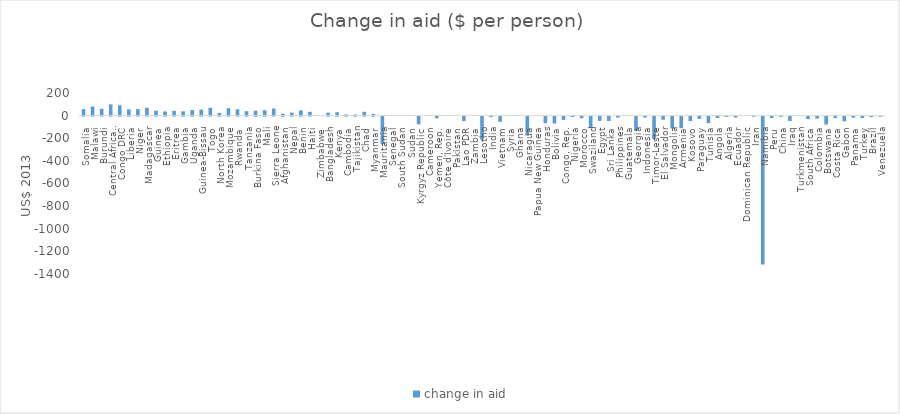
| Category | change in aid |
|---|---|
| Somalia | 57.127 |
| Malawi | 80.957 |
| Burundi | 60.013 |
| Central African Republic | 99.525 |
| Congo DRC | 91.418 |
| Liberia | 55.492 |
| Niger | 58.87 |
| Madagascar | 68.83 |
| Guinea | 44.246 |
| Ethiopia | 37.22 |
| Eritrea | 42.247 |
| Gambia | 38.083 |
| Uganda | 50.001 |
| Guinea-Bissau | 53.007 |
| Togo | 68.944 |
| North Korea | 23.821 |
| Mozambique | 65.375 |
| Rwanda | 56.21 |
| Tanzania | 39.37 |
| Burkina Faso | 44.26 |
| Mali | 48.155 |
| Sierra Leone | 62.746 |
| Afghanistan | 17.049 |
| Nepal | 26.341 |
| Benin | 46.978 |
| Haiti | 33.904 |
| Zimbabwe | 0 |
| Bangladesh | 26.076 |
| Kenya | 30.252 |
| Cambodia | 10.577 |
| Tajikistan | 9.265 |
| Chad | 33.492 |
| Myanmar | 14.387 |
| Mauritania | -244.199 |
| Senegal | 0 |
| South Sudan | 0 |
| Sudan | 0 |
| Kyrgyz Republic | -68.356 |
| Cameroon | 0 |
| Yemen, Rep. | -14.702 |
| Côte d'Ivoire | 0 |
| Pakistan | 0 |
| Lao PDR | -38.803 |
| Zambia | 0 |
| Lesotho | -203.587 |
| India | -3.679 |
| Vietnam | -46.023 |
| Syria | 0 |
| Ghana | 0 |
| Nicaragua | -168.079 |
| Papua New Guinea | 0 |
| Honduras | -57.918 |
| Bolivia | -60.599 |
| Congo, Rep. | -29.454 |
| Nigeria | -3.778 |
| Morocco | -14.431 |
| Swaziland | -100.572 |
| Egypt | -37.897 |
| Sri Lanka | -38.764 |
| Philippines | -8.31 |
| Guatemala | 0 |
| Georgia | -128.586 |
| Indonesia | -7.884 |
| Timor-Leste | -199.448 |
| El Salvador | -27.495 |
| Mongolia | -105.335 |
| Armenia | -102.579 |
| Kosovo | -39.108 |
| Paraguay | -20.189 |
| Tunisia | -57.533 |
| Angola | -12.264 |
| Algeria | -2.644 |
| Ecuador | -8.218 |
| Dominican Republic | 0 |
| Iran | -0.594 |
| Namibia | -1307.102 |
| Peru | -12.883 |
| China | -1.024 |
| Iraq | -38.662 |
| Turkmenistan | 0 |
| South Africa | -22.637 |
| Colombia | -17.425 |
| Botswana | -70.422 |
| Costa Rica | -12.999 |
| Gabon | -41.474 |
| Panama | -9.748 |
| Turkey | -12.834 |
| Brazil | -3.994 |
| Venezuela | -0.822 |